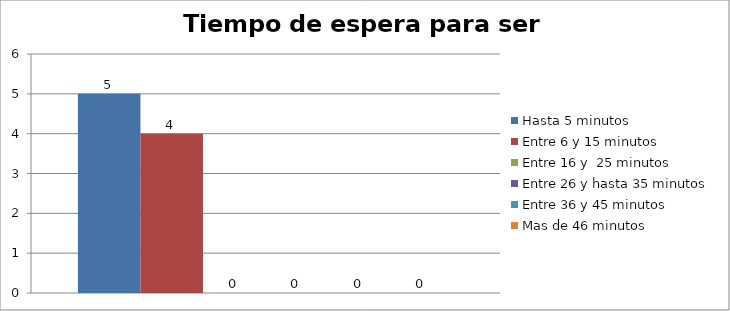
| Category | Hasta 5 minutos | Entre 6 y 15 minutos  | Entre 16 y  25 minutos | Entre 26 y hasta 35 minutos | Entre 36 y 45 minutos  | Mas de 46 minutos |
|---|---|---|---|---|---|---|
| 0 | 5 | 4 | 0 | 0 | 0 | 0 |